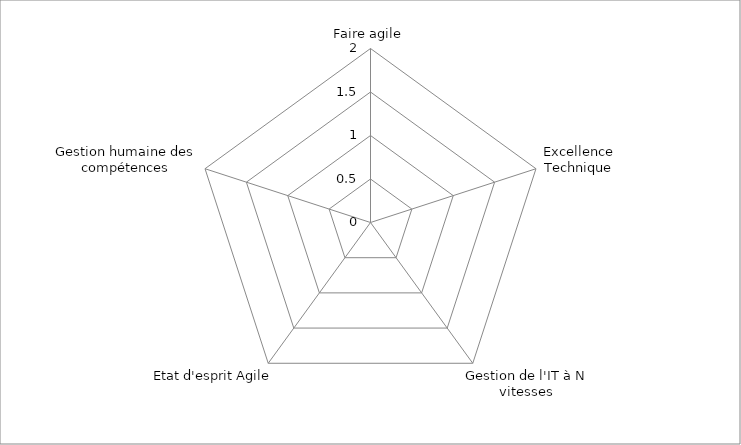
| Category | Series 0 |
|---|---|
| Faire agile | 0 |
| Excellence Technique | 0 |
| Gestion de l'IT à N vitesses | 0 |
| Etat d'esprit Agile | 0 |
| Gestion humaine des compétences | 0 |